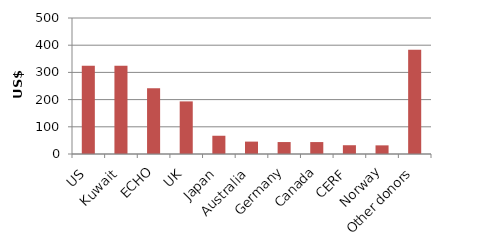
| Category | Series 1 |
|---|---|
| US | 324.781 |
| Kuwait | 324.058 |
| ECHO | 241.773 |
| UK | 193.402 |
| Japan | 67.093 |
| Australia | 45.556 |
| Germany | 43.935 |
| Canada | 43.862 |
| CERF | 32.246 |
| Norway | 31.768 |
| Other donors | 383.415 |